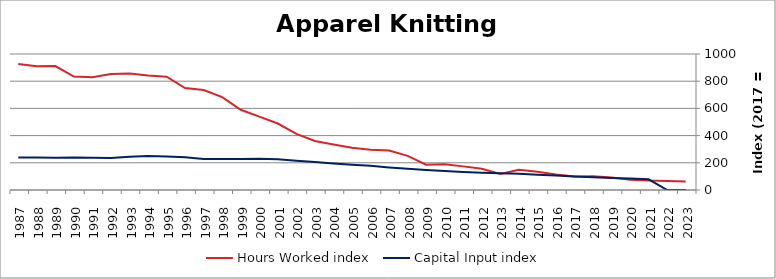
| Category | Hours Worked index | Capital Input index |
|---|---|---|
| 2023.0 | 63.267 | 0 |
| 2022.0 | 66.699 | 0 |
| 2021.0 | 69.121 | 78.819 |
| 2020.0 | 75.301 | 84.11 |
| 2019.0 | 91.211 | 88.42 |
| 2018.0 | 101.664 | 93.307 |
| 2017.0 | 100 | 100 |
| 2016.0 | 113.993 | 106.97 |
| 2015.0 | 133.579 | 113.017 |
| 2014.0 | 149.379 | 119.216 |
| 2013.0 | 118.264 | 123.503 |
| 2012.0 | 156.789 | 127.737 |
| 2011.0 | 173.727 | 132.897 |
| 2010.0 | 189.8 | 139.734 |
| 2009.0 | 185.849 | 147.768 |
| 2008.0 | 251.084 | 156.315 |
| 2007.0 | 289.798 | 165.55 |
| 2006.0 | 296.214 | 177.548 |
| 2005.0 | 311.123 | 186.353 |
| 2004.0 | 334.374 | 195.16 |
| 2003.0 | 360.457 | 205.988 |
| 2002.0 | 412.552 | 215.022 |
| 2001.0 | 488.787 | 226.757 |
| 2000.0 | 539.116 | 230.474 |
| 1999.0 | 589.755 | 227.871 |
| 1998.0 | 682.805 | 227.547 |
| 1997.0 | 734.937 | 228.4 |
| 1996.0 | 749.804 | 241.565 |
| 1995.0 | 833.276 | 246.586 |
| 1994.0 | 842.377 | 249.721 |
| 1993.0 | 856.968 | 244.906 |
| 1992.0 | 852.744 | 236.199 |
| 1991.0 | 828.464 | 236.63 |
| 1990.0 | 833.798 | 239.851 |
| 1989.0 | 910.92 | 236.422 |
| 1988.0 | 909.545 | 238.857 |
| 1987.0 | 926.573 | 239.494 |